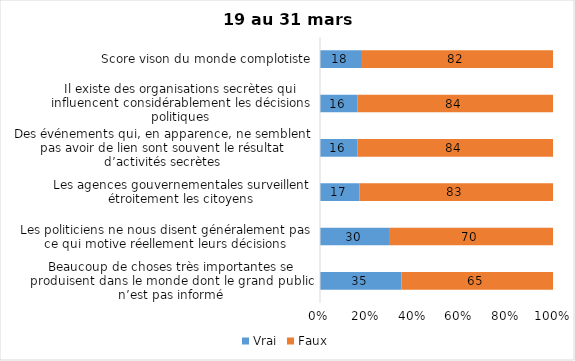
| Category | Vrai | Faux |
|---|---|---|
| Beaucoup de choses très importantes se produisent dans le monde dont le grand public n’est pas informé | 35 | 65 |
| Les politiciens ne nous disent généralement pas ce qui motive réellement leurs décisions | 30 | 70 |
| Les agences gouvernementales surveillent étroitement les citoyens | 17 | 83 |
| Des événements qui, en apparence, ne semblent pas avoir de lien sont souvent le résultat d’activités secrètes | 16 | 84 |
| Il existe des organisations secrètes qui influencent considérablement les décisions politiques | 16 | 84 |
| Score vison du monde complotiste | 18 | 82 |